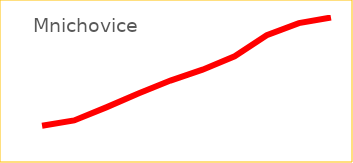
| Category | Mnichovice |
|---|---|
| 2010 | 3118 |
| 2011 | 3156 |
| 2012 | 3251 |
| 2013 | 3352 |
| 2014 | 3445 |
| 2015 | 3524 |
| 2016 | 3621 |
| 2017 | 3773 |
| 2018 | 3861 |
| 2019 | 3902 |